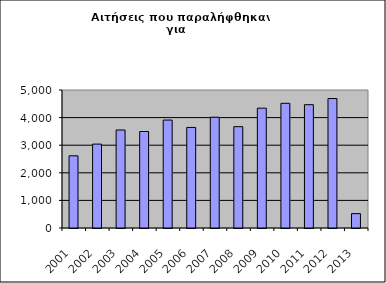
| Category | Series 0 |
|---|---|
| 2001.0 | 2615 |
| 2002.0 | 3040 |
| 2003.0 | 3551 |
| 2004.0 | 3496 |
| 2005.0 | 3911 |
| 2006.0 | 3644 |
| 2007.0 | 4014 |
| 2008.0 | 3671 |
| 2009.0 | 4342 |
| 2010.0 | 4518 |
| 2011.0 | 4468 |
| 2012.0 | 4691 |
| 2013.0 | 521 |